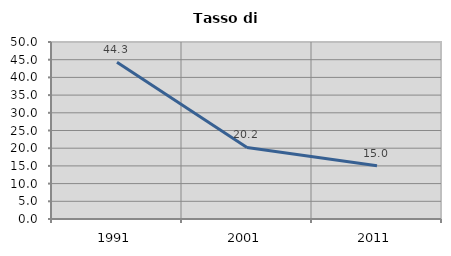
| Category | Tasso di disoccupazione   |
|---|---|
| 1991.0 | 44.293 |
| 2001.0 | 20.211 |
| 2011.0 | 15.02 |